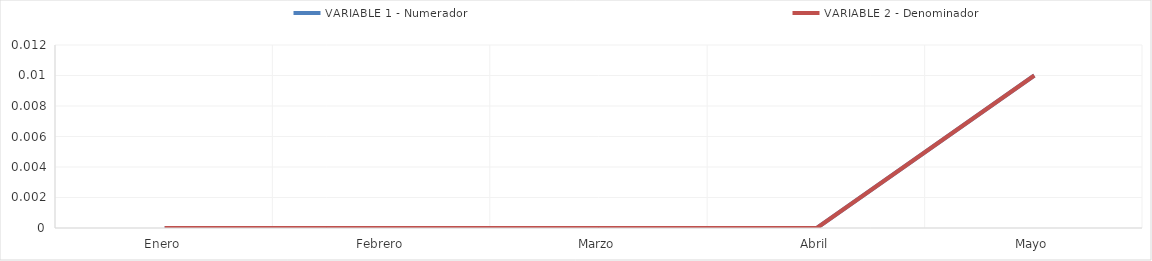
| Category | VARIABLE 1 - Numerador | VARIABLE 2 - Denominador |
|---|---|---|
| 0 | 0 | 0 |
| 1 | 0 | 0 |
| 2 | 0 | 0 |
| 3 | 0 | 0 |
| 4 | 0.01 | 0.01 |